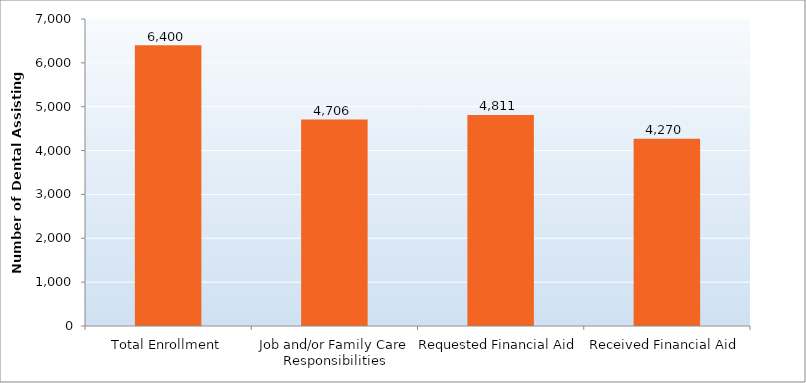
| Category | Series 0 |
|---|---|
| Total Enrollment | 6400 |
| Job and/or Family Care Responsibilities | 4706 |
| Requested Financial Aid | 4811 |
| Received Financial Aid | 4270 |